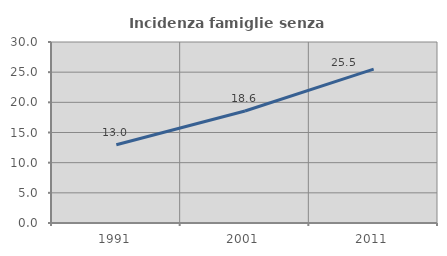
| Category | Incidenza famiglie senza nuclei |
|---|---|
| 1991.0 | 12.973 |
| 2001.0 | 18.562 |
| 2011.0 | 25.508 |